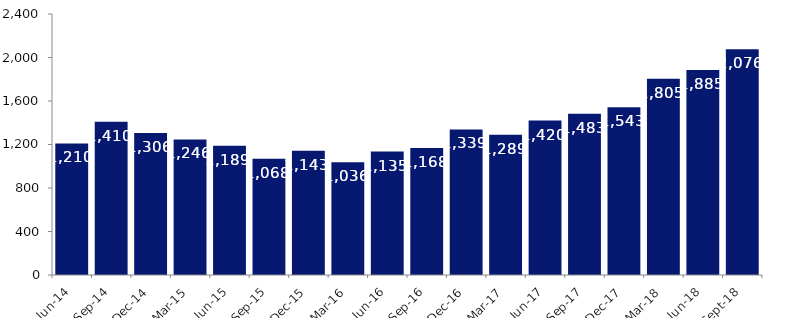
| Category | Series 0 |
|---|---|
| Jun-14 | 1210 |
| Sep-14 | 1410 |
| Dec-14 | 1306 |
| Mar-15 | 1246 |
| Jun-15 | 1189 |
| Sep-15 | 1068 |
| Dec-15 | 1143 |
| Mar-16 | 1036 |
| Jun-16 | 1135 |
| Sep-16 | 1168 |
| Dec-16 | 1339 |
| Mar-17 | 1289 |
| Jun-17 | 1420 |
| Sep-17 | 1483 |
| Dec-17 | 1543 |
| Mar-18 | 1805 |
| Jun-18 | 1885 |
| Sep-18 | 2076 |